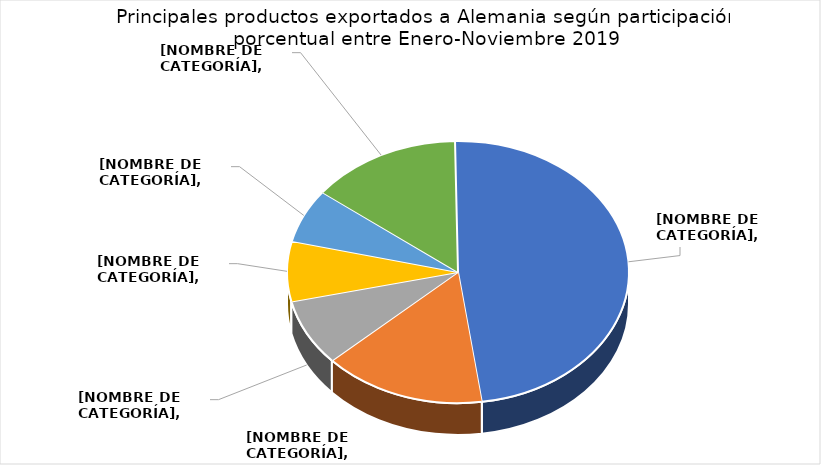
| Category | Series 0 |
|---|---|
| Harina de pescado | 0.481 |
| Aceite de palma y sus fracciones, en bruto | 0.154 |
| Café tostado, descafeinado | 0.082 |
| Piñas (ananás), frescas o secas | 0.074 |
| Cacao en grano, entero o partido, crudo o tostado | 0.066 |
| 11 productos restantes | 0.143 |